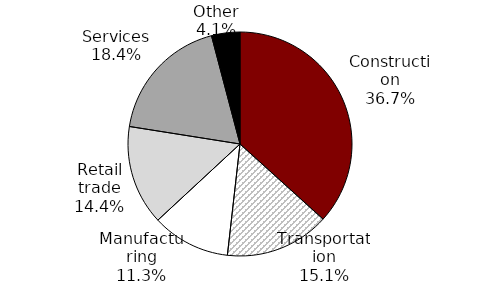
| Category | Series 0 |
|---|---|
| Construction | 0.367 |
| Transportation | 0.151 |
| Manufacturing | 0.113 |
| Retail trade | 0.144 |
| Services | 0.184 |
| Other | 0.041 |